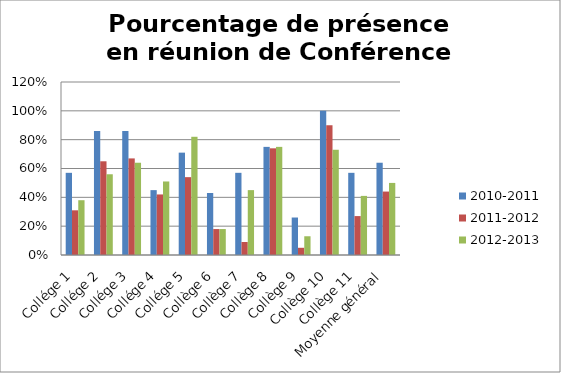
| Category | 2010-2011 | 2011-2012 | 2012-2013 |
|---|---|---|---|
| Collége 1 | 0.57 | 0.31 | 0.38 |
| Collége 2 | 0.86 | 0.65 | 0.56 |
| Collége 3 | 0.86 | 0.67 | 0.64 |
| Collége 4 | 0.45 | 0.42 | 0.51 |
| Collége 5 | 0.71 | 0.54 | 0.82 |
| Collège 6 | 0.43 | 0.18 | 0.18 |
| Collège 7 | 0.57 | 0.09 | 0.45 |
| Collège 8 | 0.75 | 0.74 | 0.75 |
| Collège 9 | 0.26 | 0.05 | 0.13 |
| Collège 10 | 1 | 0.9 | 0.73 |
| Collège 11 | 0.57 | 0.27 | 0.41 |
| Moyenne général | 0.64 | 0.44 | 0.5 |